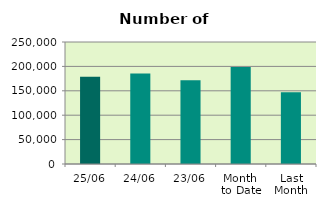
| Category | Series 0 |
|---|---|
| 25/06 | 178802 |
| 24/06 | 185462 |
| 23/06 | 171768 |
| Month 
to Date | 198830.947 |
| Last
Month | 147277.8 |